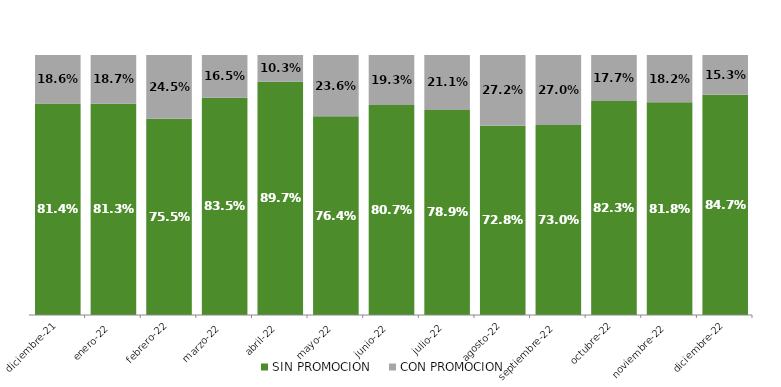
| Category | SIN PROMOCION   | CON PROMOCION   |
|---|---|---|
| 2021-12-01 | 0.814 | 0.186 |
| 2022-01-01 | 0.813 | 0.187 |
| 2022-02-01 | 0.755 | 0.245 |
| 2022-03-01 | 0.835 | 0.165 |
| 2022-04-01 | 0.897 | 0.103 |
| 2022-05-01 | 0.764 | 0.236 |
| 2022-06-01 | 0.807 | 0.193 |
| 2022-07-01 | 0.789 | 0.211 |
| 2022-08-01 | 0.728 | 0.272 |
| 2022-09-01 | 0.73 | 0.27 |
| 2022-10-01 | 0.823 | 0.177 |
| 2022-11-01 | 0.818 | 0.182 |
| 2022-12-01 | 0.847 | 0.153 |